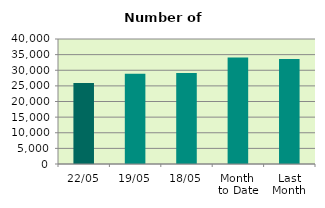
| Category | Series 0 |
|---|---|
| 22/05 | 25958 |
| 19/05 | 28888 |
| 18/05 | 29122 |
| Month 
to Date | 34106.533 |
| Last
Month | 33588.111 |